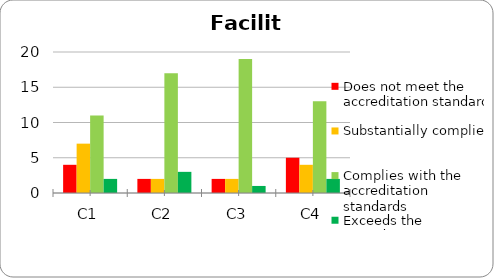
| Category | Does not meet the accreditation standard | Substantially complies | Complies with the accreditation standards | Exceeds the accreditation standards |
|---|---|---|---|---|
| C1 | 4 | 7 | 11 | 2 |
| C2 | 2 | 2 | 17 | 3 |
| C3 | 2 | 2 | 19 | 1 |
| C4 | 5 | 4 | 13 | 2 |